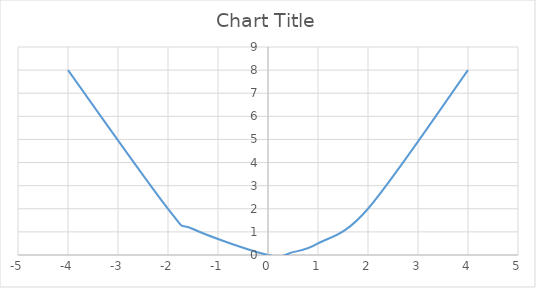
| Category | Series 0 |
|---|---|
| -4.0 | 8 |
| -2.0 | 2 |
| -1.5 | 1.125 |
| 0.0 | 0 |
| 0.5 | 0.125 |
| 1.0 | 0.5 |
| 2.0 | 2 |
| 4.0 | 8 |